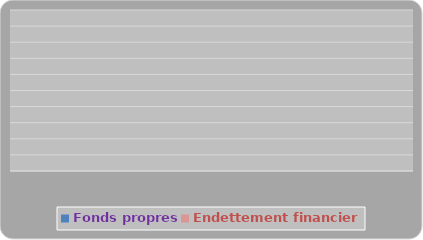
| Category | Fonds propres | Endettement financier |
|---|---|---|
|   | 0 | 0 |
|   | 0 | 0 |
|   | 0 | 0 |
|   | 0 | 0 |
|   | 0 | 0 |
|   | 0 | 0 |